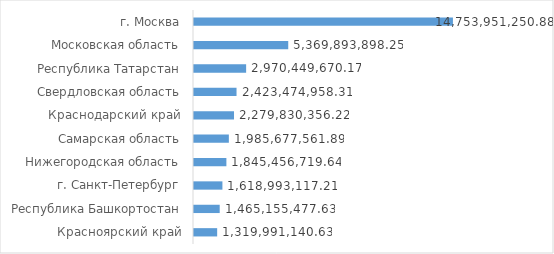
| Category | Series 0 |
|---|---|
| г. Москва | 14753951250.88 |
| Московская область | 5369893898.25 |
| Республика Татарстан | 2970449670.17 |
| Свердловская область | 2423474958.31 |
| Краснодарский край | 2279830356.22 |
| Самарская область | 1985677561.89 |
| Нижегородская область | 1845456719.64 |
| г. Санкт-Петербург | 1618993117.21 |
| Республика Башкортостан | 1465155477.63 |
| Красноярский край | 1319991140.63 |